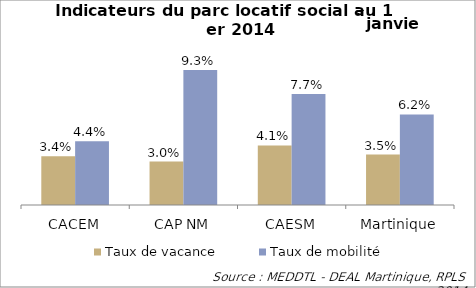
| Category | Taux de vacance | Taux de mobilité |
|---|---|---|
| CACEM | 0.034 | 0.044 |
| CAP NM | 0.03 | 0.093 |
| CAESM | 0.041 | 0.077 |
| Martinique | 0.035 | 0.062 |